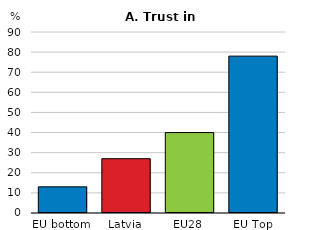
| Category | Tend to trust government |
|---|---|
| EU bottom | 13 |
| Latvia | 27 |
| EU28 | 40 |
| EU Top | 78 |